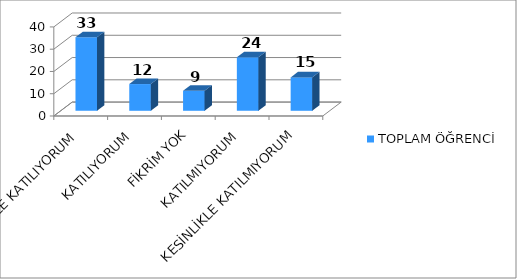
| Category | TOPLAM ÖĞRENCİ |
|---|---|
| KESİNLİKLE KATILIYORUM | 33 |
| KATILIYORUM | 12 |
| FİKRİM YOK | 9 |
| KATILMIYORUM | 24 |
| KESİNLİKLE KATILMIYORUM | 15 |